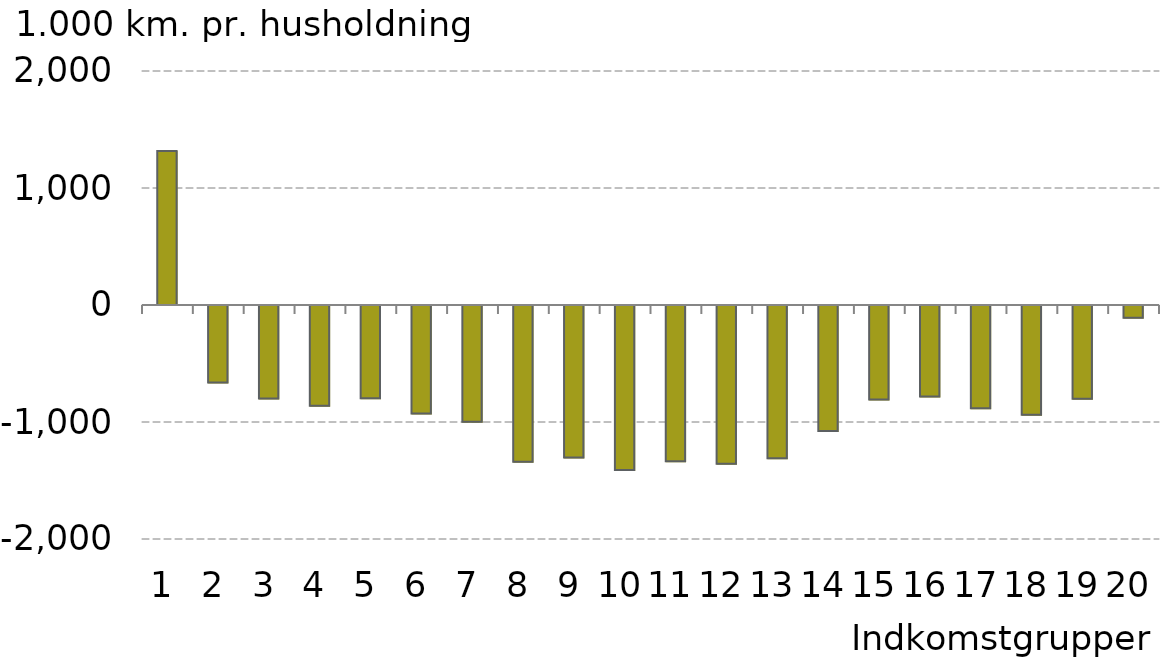
| Category |  Indkomstgrupper |
|---|---|
| 0 | 1315.872 |
| 1 | -662.015 |
| 2 | -798.811 |
| 3 | -861.798 |
| 4 | -797.144 |
| 5 | -928.337 |
| 6 | -996.807 |
| 7 | -1339.056 |
| 8 | -1302.778 |
| 9 | -1411.203 |
| 10 | -1334.913 |
| 11 | -1357.319 |
| 12 | -1309.477 |
| 13 | -1077.566 |
| 14 | -807.877 |
| 15 | -781.517 |
| 16 | -882.172 |
| 17 | -938.459 |
| 18 | -800.535 |
| 19 | -108.168 |